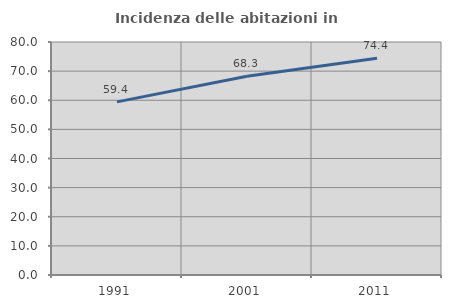
| Category | Incidenza delle abitazioni in proprietà  |
|---|---|
| 1991.0 | 59.444 |
| 2001.0 | 68.263 |
| 2011.0 | 74.404 |